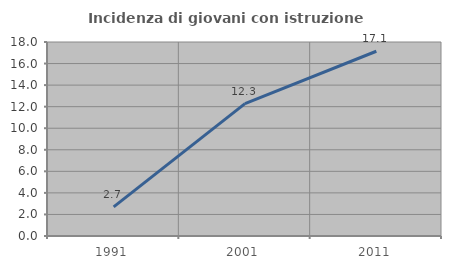
| Category | Incidenza di giovani con istruzione universitaria |
|---|---|
| 1991.0 | 2.703 |
| 2001.0 | 12.281 |
| 2011.0 | 17.143 |